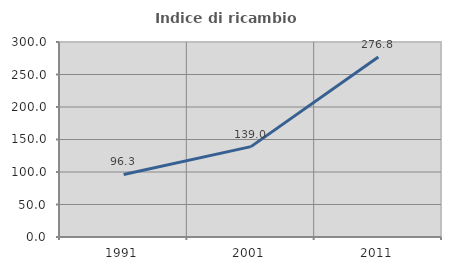
| Category | Indice di ricambio occupazionale  |
|---|---|
| 1991.0 | 96.272 |
| 2001.0 | 139.033 |
| 2011.0 | 276.833 |